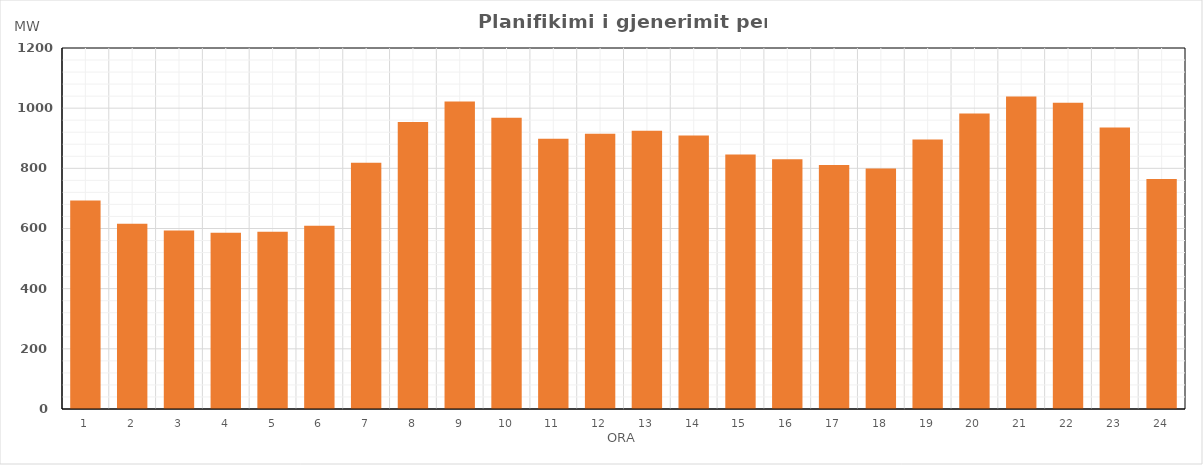
| Category | Max (MW) |
|---|---|
| 0 | 693.06 |
| 1 | 616.08 |
| 2 | 593.59 |
| 3 | 585.59 |
| 4 | 588.86 |
| 5 | 609.35 |
| 6 | 818.36 |
| 7 | 953.63 |
| 8 | 1021.8 |
| 9 | 968.13 |
| 10 | 898.34 |
| 11 | 914.95 |
| 12 | 924.7 |
| 13 | 908.84 |
| 14 | 845.93 |
| 15 | 829.91 |
| 16 | 811.2 |
| 17 | 799.23 |
| 18 | 895.95 |
| 19 | 982.05 |
| 20 | 1038.76 |
| 21 | 1017.78 |
| 22 | 936.12 |
| 23 | 764.61 |